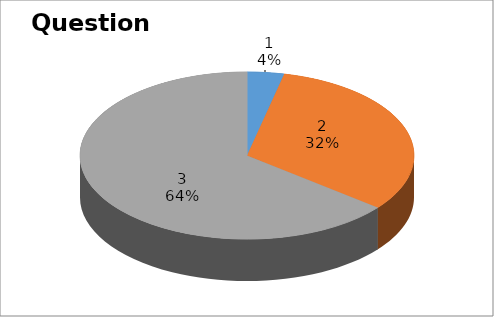
| Category | Series 0 |
|---|---|
| 0 | 1 |
| 1 | 9 |
| 2 | 18 |